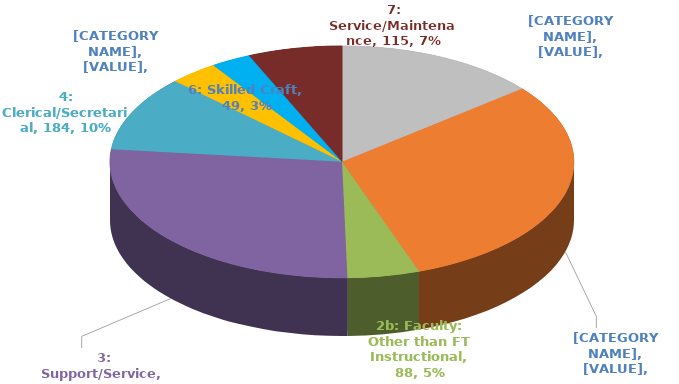
| Category | Series 0 |
|---|---|
| 1: Executive/Administrative/Managerial | 248 |
| 2a: Faculty: FT Instructional | 535 |
| 2b: Faculty: Other than FT Instructional | 88 |
| 3: Support/Service | 476 |
| 4: Clerical/Secretarial | 184 |
| 5: Technical & Paraprofessional | 60 |
| 6: Skilled Craft | 49 |
| 7: Service/Maintenance | 115 |